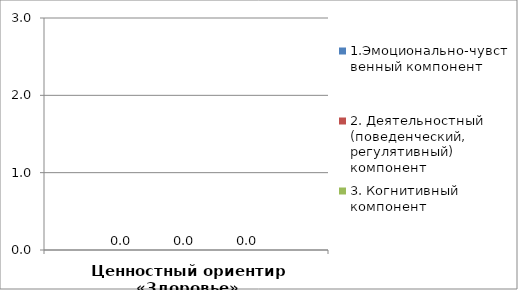
| Category | 1.Эмоционально-чувственный компонент | 2. Деятельностный (поведенческий, регулятивный) компонент | 3. Когнитивный компонент |
|---|---|---|---|
| Ценностный ориентир «Здоровье» | 0 | 0 | 0 |